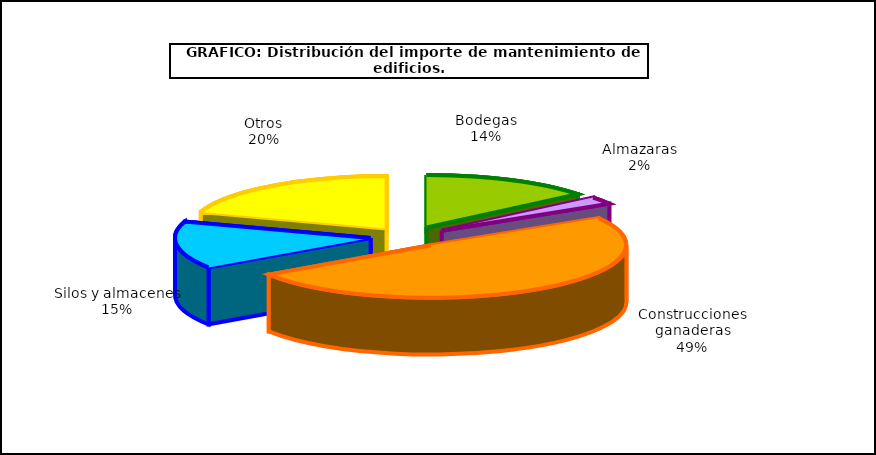
| Category | Series 0 |
|---|---|
| 0 | 74.095 |
| 1 | 12.056 |
| 2 | 258.886 |
| 3 | 76.497 |
| 4 | 104.911 |